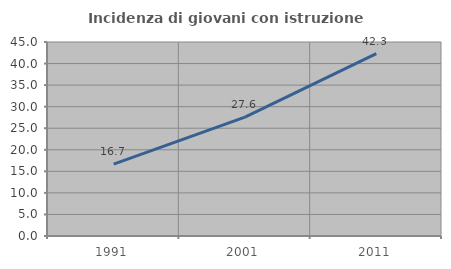
| Category | Incidenza di giovani con istruzione universitaria |
|---|---|
| 1991.0 | 16.667 |
| 2001.0 | 27.586 |
| 2011.0 | 42.308 |